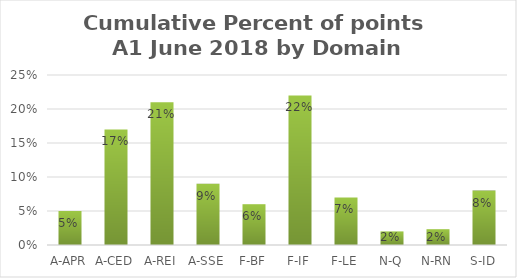
| Category | Series 0 |
|---|---|
| A-APR | 0.05 |
| A-CED | 0.17 |
| A-REI | 0.21 |
| A-SSE | 0.09 |
| F-BF | 0.06 |
| F-IF | 0.22 |
| F-LE | 0.07 |
| N-Q | 0.02 |
| N-RN | 0.023 |
| S-ID | 0.08 |